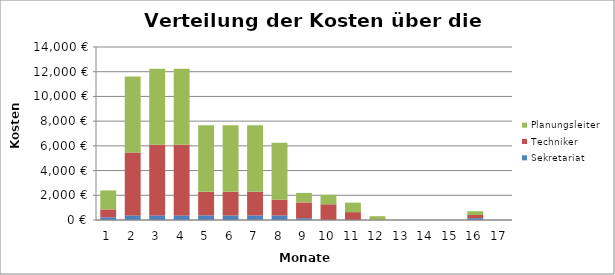
| Category | Sekretariat | Techniker | Planungsleiter |
|---|---|---|---|
| 1.0 | 222.726 | 636.361 | 1537.872 |
| 2.0 | 371.211 | 5090.888 | 6151.49 |
| 3.0 | 371.211 | 5727.249 | 6151.49 |
| 4.0 | 371.211 | 5727.249 | 6151.49 |
| 5.0 | 371.211 | 1909.083 | 5382.554 |
| 6.0 | 371.211 | 1909.083 | 5382.554 |
| 7.0 | 371.211 | 1909.083 | 5382.554 |
| 8.0 | 371.211 | 1272.722 | 4613.617 |
| 9.0 | 148.484 | 1272.722 | 768.936 |
| 10.0 | 0 | 1272.722 | 768.936 |
| 11.0 | 0 | 636.361 | 768.936 |
| 12.0 | 0 | 0 | 307.574 |
| 13.0 | 0 | 0 | 0 |
| 14.0 | 0 | 0 | 0 |
| 15.0 | 0 | 0 | 0 |
| 16.0 | 148.484 | 254.544 | 307.574 |
| 17.0 | 0 | 0 | 0 |